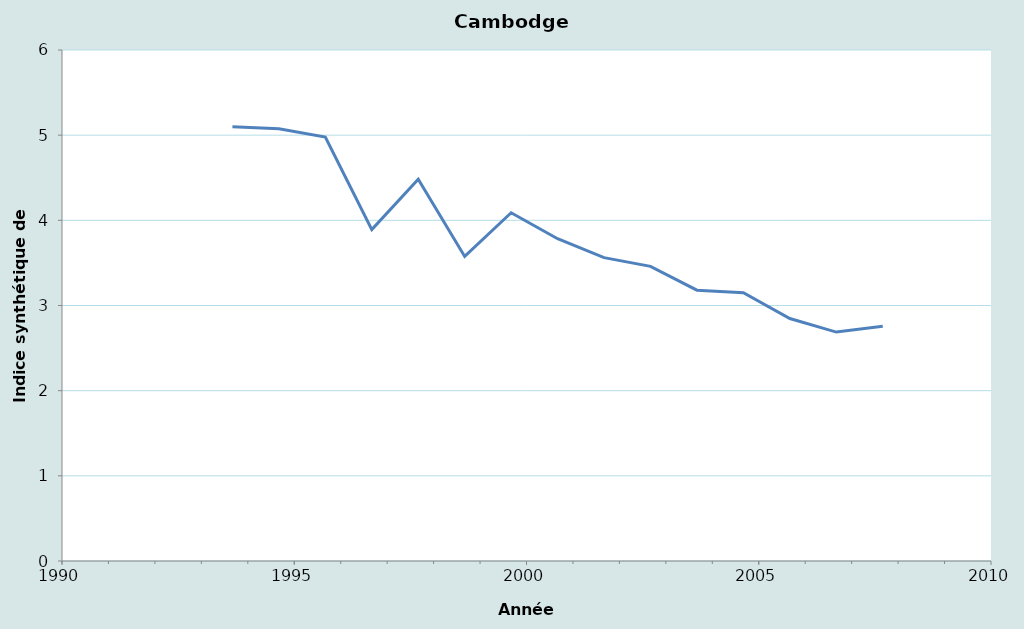
| Category | Series 0 |
|---|---|
| 2007.6693989071039 | 2.755 |
| 2006.6693989071039 | 2.688 |
| 2005.6693989071039 | 2.847 |
| 2004.6693989071039 | 3.15 |
| 2003.6693989071039 | 3.18 |
| 2002.6693989071039 | 3.46 |
| 2001.6693989071039 | 3.562 |
| 2000.6693989071039 | 3.784 |
| 1999.6693989071039 | 4.089 |
| 1998.6693989071039 | 3.576 |
| 1997.6693989071039 | 4.483 |
| 1996.6693989071039 | 3.891 |
| 1995.6693989071039 | 4.978 |
| 1994.6693989071039 | 5.074 |
| 1993.6693989071039 | 5.097 |